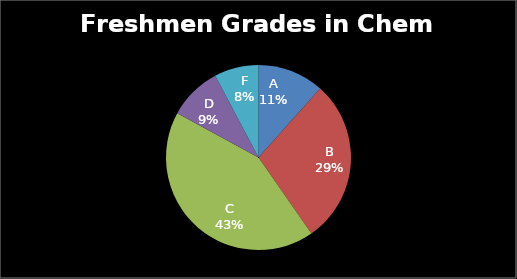
| Category | Series 0 |
|---|---|
| A | 15 |
| B | 37 |
| C | 55 |
| D | 12 |
| F | 10 |